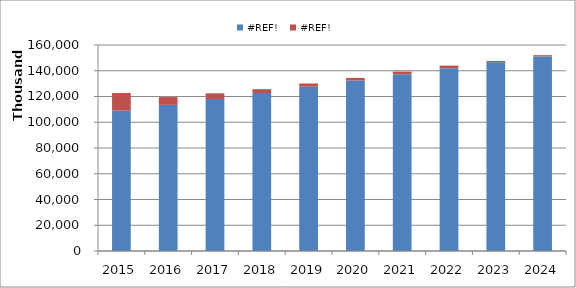
| Category | #REF! |
|---|---|
| 2015.0 | 13621000 |
| 2016.0 | 6000000 |
| 2017.0 | 4500000 |
| 2018.0 | 3000000 |
| 2019.0 | 2500000 |
| 2020.0 | 2000000 |
| 2021.0 | 2000000 |
| 2022.0 | 2000000 |
| 2023.0 | 1000000 |
| 2024.0 | 1000000 |